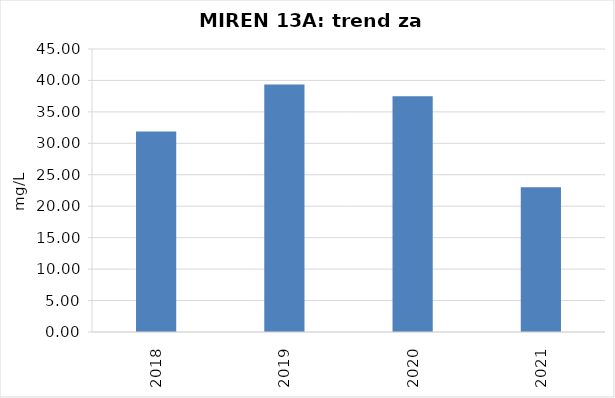
| Category | Vsota |
|---|---|
| 2018 | 31.9 |
| 2019 | 39.35 |
| 2020 | 37.5 |
| 2021 | 23 |